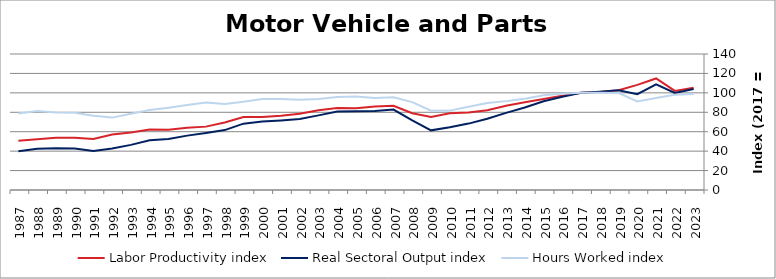
| Category | Labor Productivity index | Real Sectoral Output index | Hours Worked index |
|---|---|---|---|
| 2023.0 | 105.153 | 103.925 | 98.832 |
| 2022.0 | 102.012 | 99.918 | 97.948 |
| 2021.0 | 114.848 | 108.82 | 94.752 |
| 2020.0 | 108.255 | 98.633 | 91.112 |
| 2019.0 | 102.713 | 102.584 | 99.875 |
| 2018.0 | 101.011 | 101.131 | 100.119 |
| 2017.0 | 100 | 100 | 100 |
| 2016.0 | 97.058 | 96.045 | 98.956 |
| 2015.0 | 93.706 | 91.349 | 97.484 |
| 2014.0 | 90.235 | 84.854 | 94.036 |
| 2013.0 | 86.814 | 79.421 | 91.484 |
| 2012.0 | 82.025 | 73.377 | 89.458 |
| 2011.0 | 79.789 | 68.353 | 85.668 |
| 2010.0 | 79.023 | 64.584 | 81.728 |
| 2009.0 | 75.292 | 61.411 | 81.564 |
| 2008.0 | 79.081 | 71.567 | 90.497 |
| 2007.0 | 86.71 | 82.837 | 95.533 |
| 2006.0 | 85.891 | 81.27 | 94.621 |
| 2005.0 | 84.132 | 80.98 | 96.253 |
| 2004.0 | 84.292 | 80.768 | 95.819 |
| 2003.0 | 82.085 | 76.833 | 93.602 |
| 2002.0 | 78.605 | 73.018 | 92.892 |
| 2001.0 | 76.335 | 71.527 | 93.702 |
| 2000.0 | 75.232 | 70.437 | 93.627 |
| 1999.0 | 75.221 | 68.315 | 90.818 |
| 1998.0 | 69.547 | 61.649 | 88.644 |
| 1997.0 | 65.235 | 58.7 | 89.983 |
| 1996.0 | 63.99 | 55.981 | 87.484 |
| 1995.0 | 61.941 | 52.472 | 84.713 |
| 1994.0 | 62.243 | 51.262 | 82.358 |
| 1993.0 | 59.092 | 46.438 | 78.586 |
| 1992.0 | 57.217 | 42.636 | 74.516 |
| 1991.0 | 52.492 | 40.068 | 76.333 |
| 1990.0 | 53.694 | 42.745 | 79.609 |
| 1989.0 | 53.768 | 42.963 | 79.904 |
| 1988.0 | 52.163 | 42.404 | 81.292 |
| 1987.0 | 50.785 | 39.953 | 78.671 |